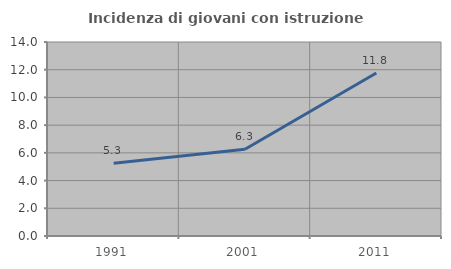
| Category | Incidenza di giovani con istruzione universitaria |
|---|---|
| 1991.0 | 5.252 |
| 2001.0 | 6.259 |
| 2011.0 | 11.761 |